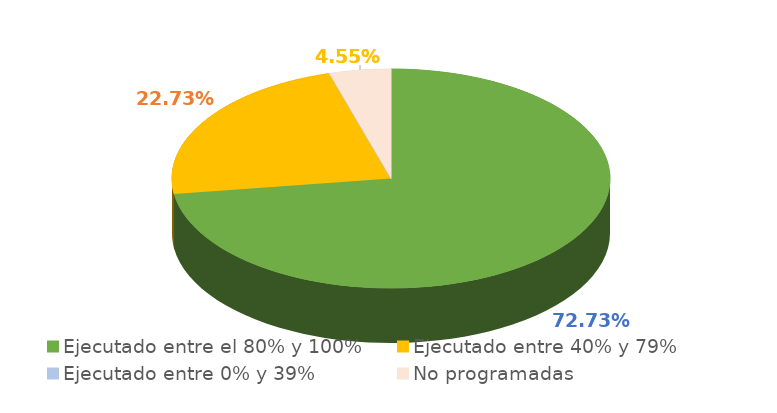
| Category | Series 0 |
|---|---|
| Ejecutado entre el 80% y 100% | 0.727 |
| Ejecutado entre 40% y 79% | 0.227 |
| Ejecutado entre 0% y 39% | 0 |
| No programadas | 0.045 |